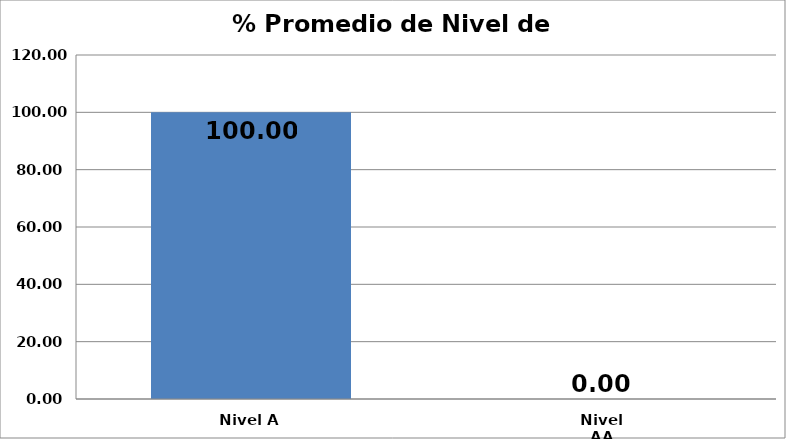
| Category | Series 0 |
|---|---|
| Nivel A | 100 |
| Nivel AA | 0 |